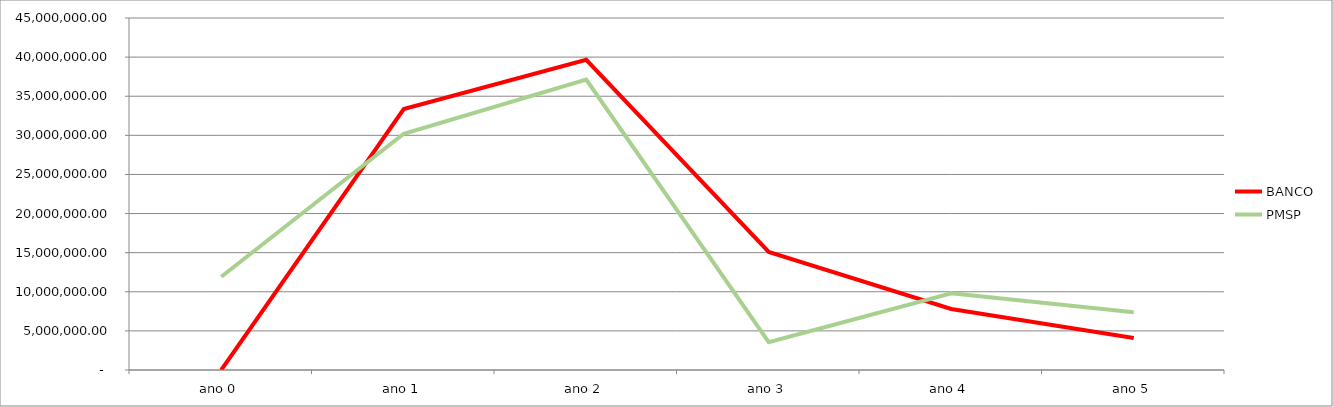
| Category | BANCO | PMSP |
|---|---|---|
| ano 0 | 0 | 11919191.919 |
| ano 1 | 33362931.061 | 30203030.303 |
| ano 2 | 39660736.184 | 37114141.414 |
| ano 3 | 15096969.877 | 3558859.259 |
| ano 4 | 7796558.498 | 9811206.061 |
| ano 5 | 4082804.385 | 7393571.044 |